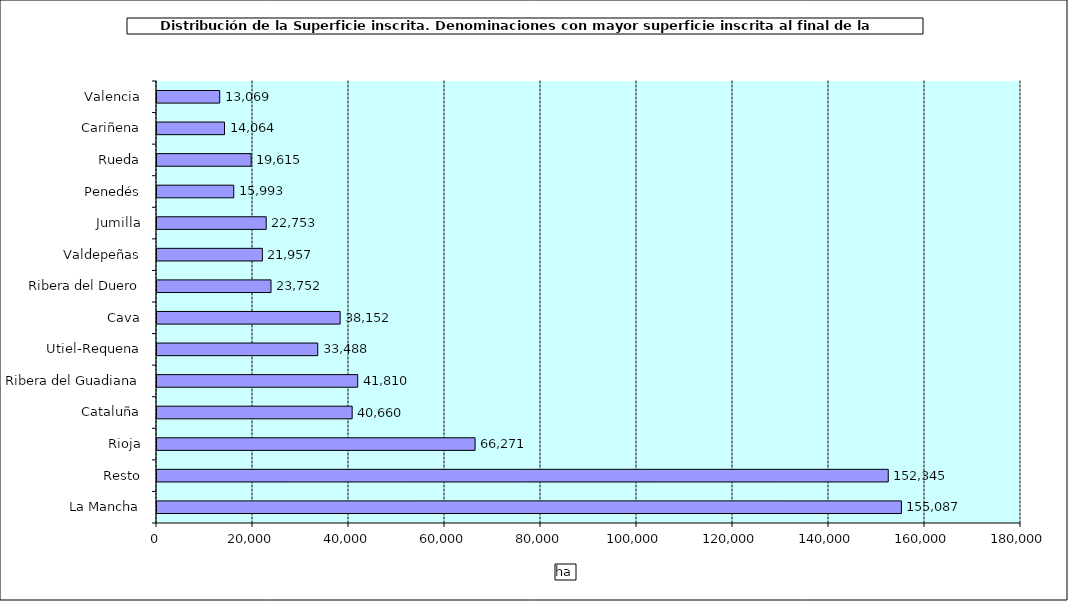
| Category | Series 0 |
|---|---|
| 0 | 155087 |
| 1 | 152345 |
| 2 | 66271 |
| 3 | 40660 |
| 4 | 41810 |
| 5 | 33488 |
| 6 | 38152 |
| 7 | 23752 |
| 8 | 21957 |
| 9 | 22753 |
| 10 | 15993 |
| 11 | 19615 |
| 12 | 14064 |
| 13 | 13069 |